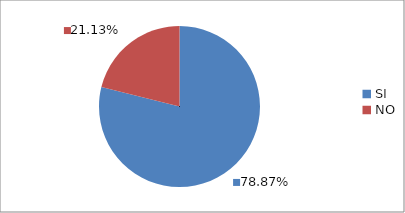
| Category | Series 0 |
|---|---|
| SI | 0.789 |
| NO | 0.211 |